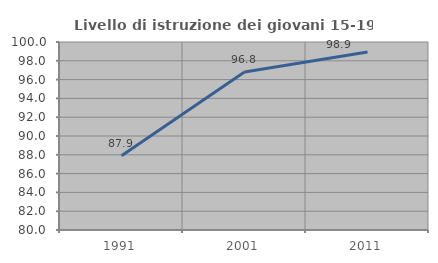
| Category | Livello di istruzione dei giovani 15-19 anni |
|---|---|
| 1991.0 | 87.895 |
| 2001.0 | 96.815 |
| 2011.0 | 98.947 |